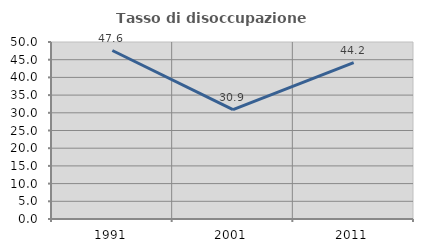
| Category | Tasso di disoccupazione giovanile  |
|---|---|
| 1991.0 | 47.596 |
| 2001.0 | 30.894 |
| 2011.0 | 44.156 |